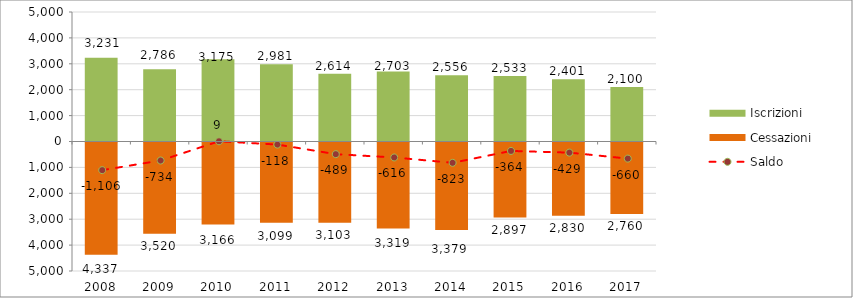
| Category | Iscrizioni | Cessazioni |
|---|---|---|
| 2008.0 | 3231 | -4337 |
| 2009.0 | 2786 | -3520 |
| 2010.0 | 3175 | -3166 |
| 2011.0 | 2981 | -3099 |
| 2012.0 | 2614 | -3103 |
| 2013.0 | 2703 | -3319 |
| 2014.0 | 2556 | -3379 |
| 2015.0 | 2533 | -2897 |
| 2016.0 | 2401 | -2830 |
| 2017.0 | 2100 | -2760 |